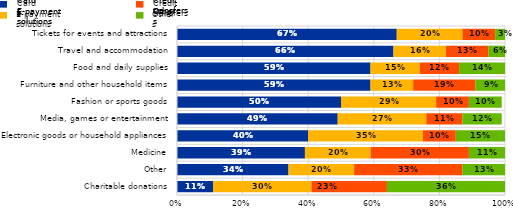
| Category | Cards | E-payment solutions | Credit transfers | Others |
|---|---|---|---|---|
| Charitable donations | 0.11 | 0.3 | 0.23 | 0.36 |
| Other | 0.34 | 0.2 | 0.33 | 0.13 |
| Medicine | 0.39 | 0.2 | 0.3 | 0.11 |
| Electronic goods or household appliances | 0.4 | 0.35 | 0.1 | 0.15 |
| Media, games or entertainment | 0.49 | 0.27 | 0.11 | 0.12 |
| Fashion or sports goods | 0.5 | 0.29 | 0.1 | 0.1 |
| Furniture and other household items | 0.59 | 0.13 | 0.19 | 0.09 |
| Food and daily supplies | 0.59 | 0.15 | 0.12 | 0.14 |
| Travel and accommodation | 0.66 | 0.16 | 0.13 | 0.06 |
| Tickets for events and attractions | 0.67 | 0.2 | 0.1 | 0.03 |